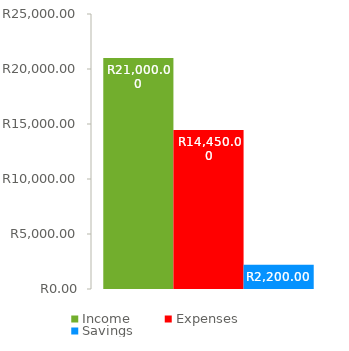
| Category | Income | Expenses | Savings |
|---|---|---|---|
| 0 | 21000 | 14450 | 2200 |